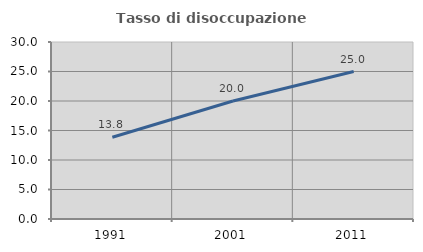
| Category | Tasso di disoccupazione giovanile  |
|---|---|
| 1991.0 | 13.846 |
| 2001.0 | 20 |
| 2011.0 | 25 |